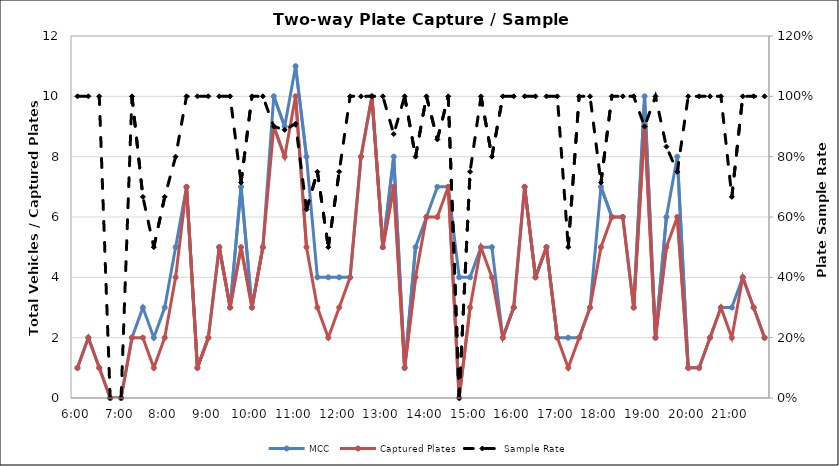
| Category | MCC | Captured Plates |
|---|---|---|
| 0.25 | 1 | 1 |
| 0.260416666666667 | 2 | 2 |
| 0.270833333333333 | 1 | 1 |
| 0.28125 | 0 | 0 |
| 0.291666666666667 | 0 | 0 |
| 0.302083333333333 | 2 | 2 |
| 0.3125 | 3 | 2 |
| 0.322916666666667 | 2 | 1 |
| 0.333333333333333 | 3 | 2 |
| 0.34375 | 5 | 4 |
| 0.354166666666667 | 7 | 7 |
| 0.364583333333333 | 1 | 1 |
| 0.375 | 2 | 2 |
| 0.385416666666667 | 5 | 5 |
| 0.395833333333333 | 3 | 3 |
| 0.40625 | 7 | 5 |
| 0.416666666666667 | 3 | 3 |
| 0.427083333333333 | 5 | 5 |
| 0.4375 | 10 | 9 |
| 0.447916666666667 | 9 | 8 |
| 0.458333333333333 | 11 | 10 |
| 0.46875 | 8 | 5 |
| 0.479166666666667 | 4 | 3 |
| 0.489583333333333 | 4 | 2 |
| 0.5 | 4 | 3 |
| 0.510416666666667 | 4 | 4 |
| 0.520833333333333 | 8 | 8 |
| 0.53125 | 10 | 10 |
| 0.541666666666667 | 5 | 5 |
| 0.552083333333333 | 8 | 7 |
| 0.5625 | 1 | 1 |
| 0.572916666666667 | 5 | 4 |
| 0.583333333333333 | 6 | 6 |
| 0.59375 | 7 | 6 |
| 0.604166666666667 | 7 | 7 |
| 0.614583333333333 | 4 | 0 |
| 0.625 | 4 | 3 |
| 0.635416666666667 | 5 | 5 |
| 0.645833333333333 | 5 | 4 |
| 0.65625 | 2 | 2 |
| 0.666666666666667 | 3 | 3 |
| 0.677083333333333 | 7 | 7 |
| 0.6875 | 4 | 4 |
| 0.697916666666667 | 5 | 5 |
| 0.708333333333333 | 2 | 2 |
| 0.71875 | 2 | 1 |
| 0.729166666666667 | 2 | 2 |
| 0.739583333333333 | 3 | 3 |
| 0.75 | 7 | 5 |
| 0.760416666666667 | 6 | 6 |
| 0.770833333333333 | 6 | 6 |
| 0.78125 | 3 | 3 |
| 0.791666666666667 | 10 | 9 |
| 0.802083333333333 | 2 | 2 |
| 0.8125 | 6 | 5 |
| 0.822916666666667 | 8 | 6 |
| 0.833333333333333 | 1 | 1 |
| 0.84375 | 1 | 1 |
| 0.854166666666667 | 2 | 2 |
| 0.864583333333333 | 3 | 3 |
| 0.875 | 3 | 2 |
| 0.885416666666667 | 4 | 4 |
| 0.895833333333333 | 3 | 3 |
| 0.90625 | 2 | 2 |